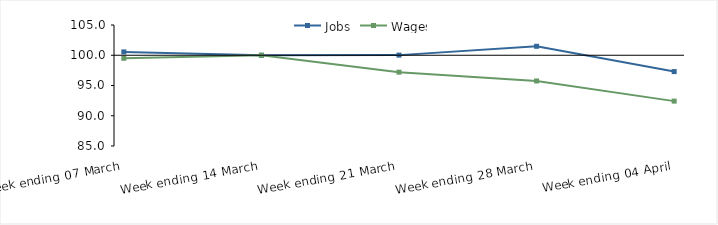
| Category | Jobs | Wages |
|---|---|---|
| 0 | 100.555 | 99.496 |
| 1900-01-01 | 100 | 100 |
| 1900-01-02 | 100.021 | 97.202 |
| 1900-01-03 | 101.483 | 95.75 |
| 1900-01-04 | 97.298 | 92.419 |